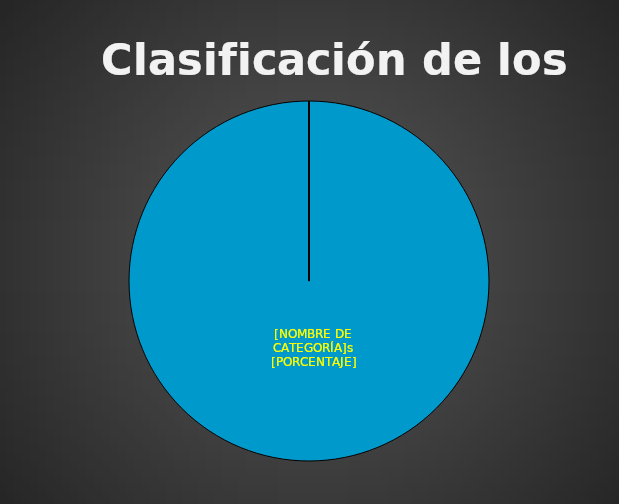
| Category | Series 0 |
|---|---|
| Estratégico | 10 |
| Operativo | 0 |
| Financiero | 0 |
| Cumplimiento | 0 |
| Tecnológico | 0 |
| Confianza e imagen | 0 |